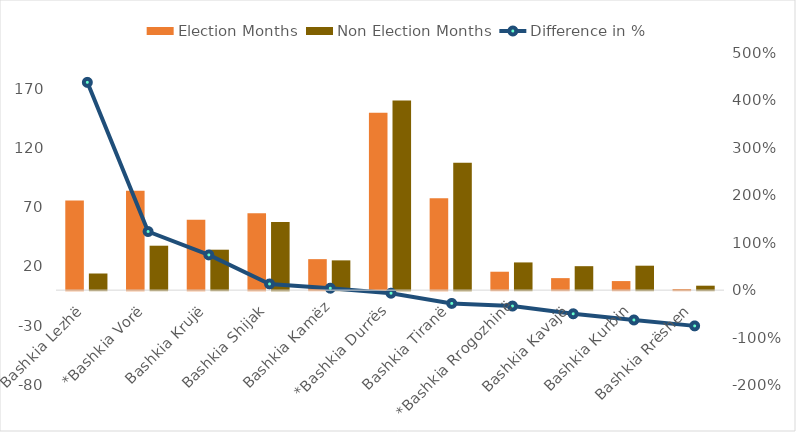
| Category | Election Months | Non Election Months |
|---|---|---|
| Bashkia Lezhë | 75.522 | 14.036 |
| *Bashkia Vorë | 83.794 | 37.476 |
| Bashkia Krujë | 59.441 | 34.107 |
| Bashkia Shijak | 64.91 | 57.422 |
| Bashkia Kamëz | 26.14 | 25.112 |
| *Bashkia Durrës | 149.578 | 159.885 |
| Bashkia Tiranë | 77.421 | 107.494 |
| *Bashkia Rrogozhinë | 15.533 | 23.376 |
| Bashkia Kavajë | 10.134 | 20.207 |
| Bashkia Kurbin | 7.651 | 20.618 |
| Bashkia Rrëshen | 0.924 | 3.751 |